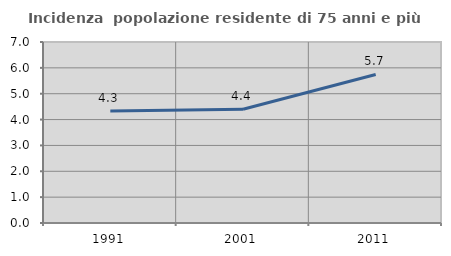
| Category | Incidenza  popolazione residente di 75 anni e più |
|---|---|
| 1991.0 | 4.336 |
| 2001.0 | 4.4 |
| 2011.0 | 5.746 |